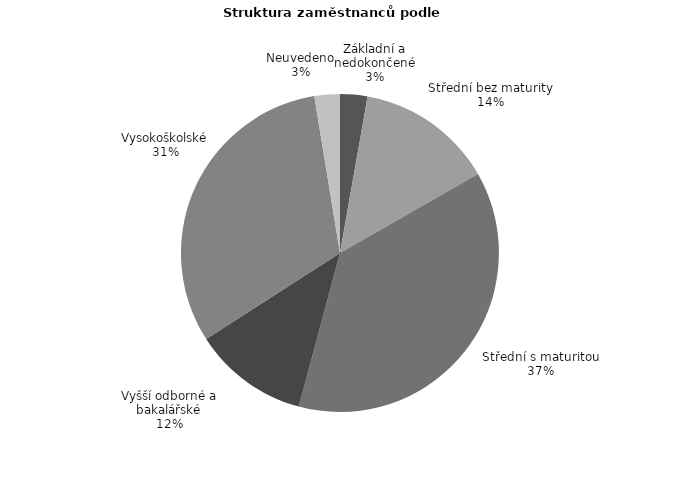
| Category | Series 0 |
|---|---|
| Základní a nedokončené | 18.119 |
| Střední bez maturity | 90.949 |
| Střední s maturitou | 244.154 |
| Vyšší odborné a bakalářské | 76.559 |
| Vysokoškolské | 205.324 |
| Neuvedeno | 16.878 |